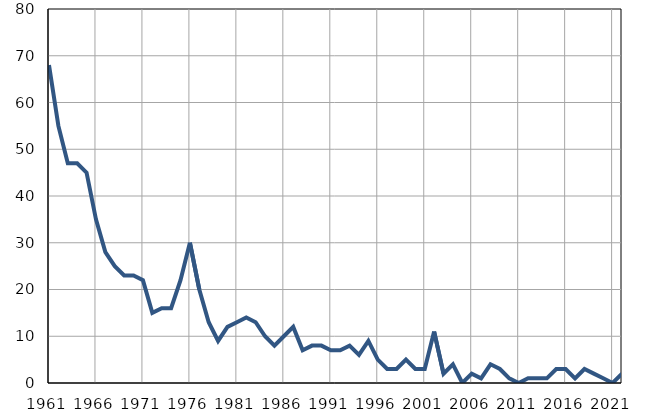
| Category | Умрла 
одојчад |
|---|---|
| 1961.0 | 68 |
| 1962.0 | 55 |
| 1963.0 | 47 |
| 1964.0 | 47 |
| 1965.0 | 45 |
| 1966.0 | 35 |
| 1967.0 | 28 |
| 1968.0 | 25 |
| 1969.0 | 23 |
| 1970.0 | 23 |
| 1971.0 | 22 |
| 1972.0 | 15 |
| 1973.0 | 16 |
| 1974.0 | 16 |
| 1975.0 | 22 |
| 1976.0 | 30 |
| 1977.0 | 20 |
| 1978.0 | 13 |
| 1979.0 | 9 |
| 1980.0 | 12 |
| 1981.0 | 13 |
| 1982.0 | 14 |
| 1983.0 | 13 |
| 1984.0 | 10 |
| 1985.0 | 8 |
| 1986.0 | 10 |
| 1987.0 | 12 |
| 1988.0 | 7 |
| 1989.0 | 8 |
| 1990.0 | 8 |
| 1991.0 | 7 |
| 1992.0 | 7 |
| 1993.0 | 8 |
| 1994.0 | 6 |
| 1995.0 | 9 |
| 1996.0 | 5 |
| 1997.0 | 3 |
| 1998.0 | 3 |
| 1999.0 | 5 |
| 2000.0 | 3 |
| 2001.0 | 3 |
| 2002.0 | 11 |
| 2003.0 | 2 |
| 2004.0 | 4 |
| 2005.0 | 0 |
| 2006.0 | 2 |
| 2007.0 | 1 |
| 2008.0 | 4 |
| 2009.0 | 3 |
| 2010.0 | 1 |
| 2011.0 | 0 |
| 2012.0 | 1 |
| 2013.0 | 1 |
| 2014.0 | 1 |
| 2015.0 | 3 |
| 2016.0 | 3 |
| 2017.0 | 1 |
| 2018.0 | 3 |
| 2019.0 | 2 |
| 2020.0 | 1 |
| 2021.0 | 0 |
| 2022.0 | 2 |